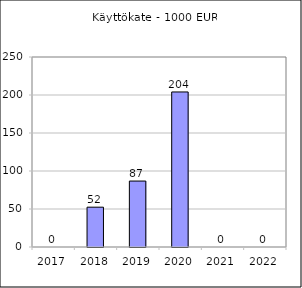
| Category | Käyttökate |
|---|---|
| 2017.0 | 0 |
| 2018.0 | 52395.2 |
| 2019.0 | 86778.12 |
| 2020.0 | 204000 |
| 2021.0 | 0 |
| 2022.0 | 0 |